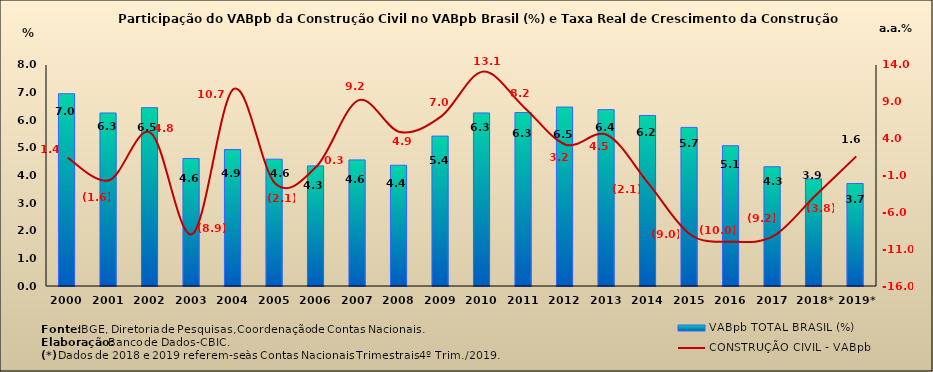
| Category | VABpb TOTAL BRASIL (%) |
|---|---|
| 2000 | 6.96 |
| 2001 | 6.264 |
| 2002 | 6.454 |
| 2003 | 4.615 |
| 2004 | 4.937 |
| 2005 | 4.589 |
| 2006 | 4.348 |
| 2007 | 4.564 |
| 2008 | 4.371 |
| 2009 | 5.426 |
| 2010 | 6.265 |
| 2011 | 6.277 |
| 2012 | 6.478 |
| 2013 | 6.382 |
| 2014 | 6.173 |
| 2015 | 5.742 |
| 2016 | 5.077 |
| 2017 | 4.316 |
| 2018* | 3.876 |
| 2019* | 3.709 |